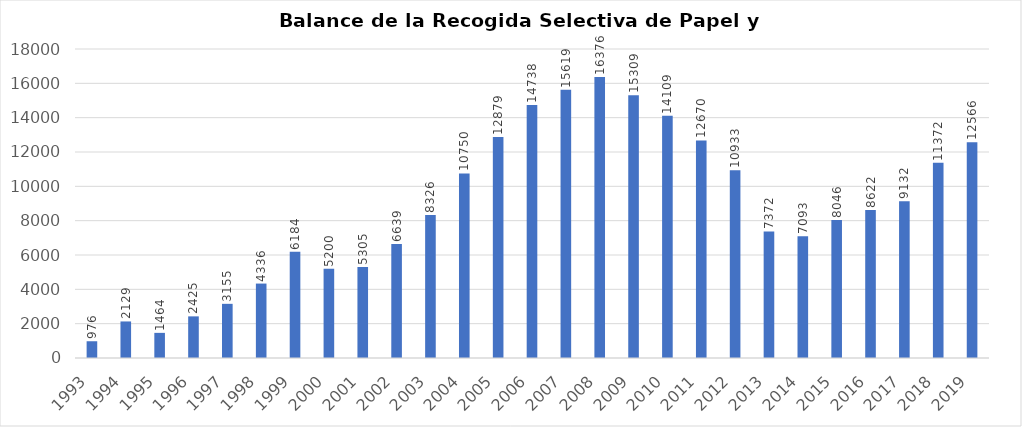
| Category | Series 0 |
|---|---|
| 1993.0 | 976 |
| 1994.0 | 2129 |
| 1995.0 | 1464 |
| 1996.0 | 2425 |
| 1997.0 | 3155 |
| 1998.0 | 4336 |
| 1999.0 | 6184 |
| 2000.0 | 5200 |
| 2001.0 | 5305 |
| 2002.0 | 6639 |
| 2003.0 | 8326 |
| 2004.0 | 10750 |
| 2005.0 | 12879 |
| 2006.0 | 14738 |
| 2007.0 | 15619 |
| 2008.0 | 16376 |
| 2009.0 | 15309 |
| 2010.0 | 14109 |
| 2011.0 | 12670 |
| 2012.0 | 10933 |
| 2013.0 | 7372 |
| 2014.0 | 7093 |
| 2015.0 | 8046 |
| 2016.0 | 8622 |
| 2017.0 | 9132 |
| 2018.0 | 11372 |
| 2019.0 | 12566 |